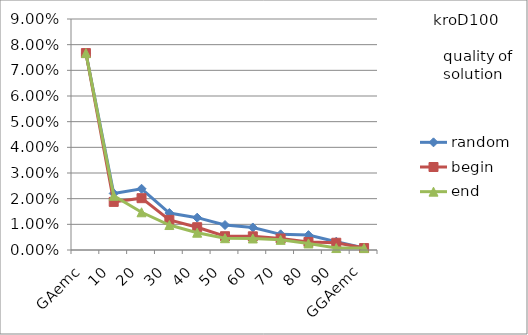
| Category | random | begin | end |
|---|---|---|---|
| 0 | 0.077 | 0.077 | 0.077 |
| 1 | 0.022 | 0.019 | 0.021 |
| 2 | 0.024 | 0.02 | 0.015 |
| 3 | 0.014 | 0.012 | 0.01 |
| 4 | 0.013 | 0.009 | 0.007 |
| 5 | 0.01 | 0.005 | 0.005 |
| 6 | 0.009 | 0.005 | 0.004 |
| 7 | 0.006 | 0.004 | 0.004 |
| 8 | 0.006 | 0.003 | 0.003 |
| 9 | 0.003 | 0.003 | 0.001 |
| 10 | 0.001 | 0.001 | 0.001 |